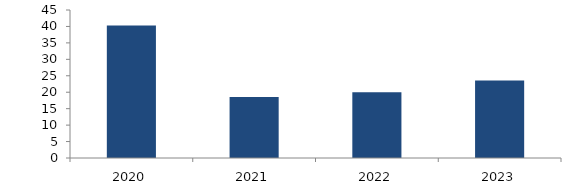
| Category | Bogotá |
|---|---|
| 2020.0 | 40.313 |
| 2021.0 | 18.533 |
| 2022.0 | 19.962 |
| 2023.0 | 23.527 |